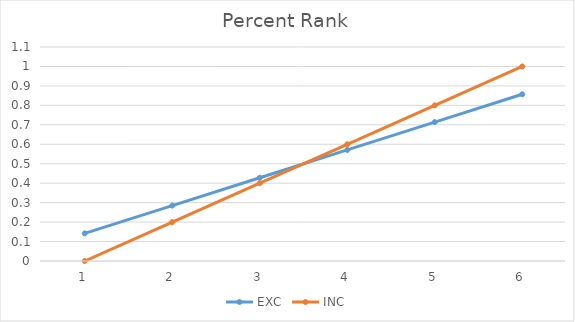
| Category | EXC | INC |
|---|---|---|
| 0 | 0.142 | 0 |
| 1 | 0.285 | 0.2 |
| 2 | 0.428 | 0.4 |
| 3 | 0.571 | 0.6 |
| 4 | 0.714 | 0.8 |
| 5 | 0.857 | 1 |